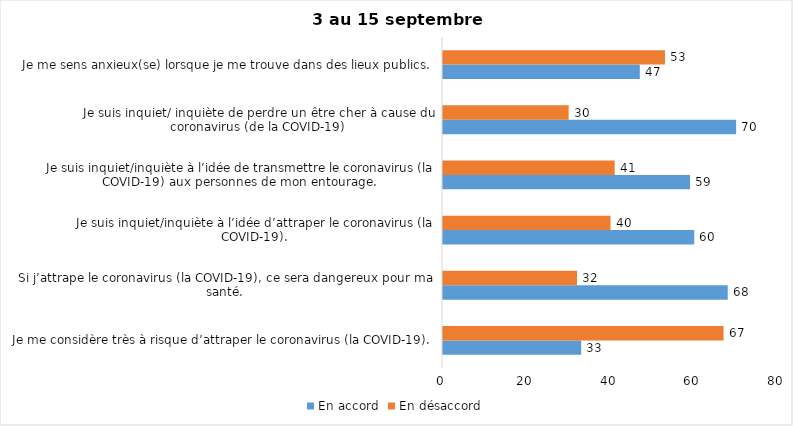
| Category | En accord | En désaccord |
|---|---|---|
| Je me considère très à risque d’attraper le coronavirus (la COVID-19). | 33 | 67 |
| Si j’attrape le coronavirus (la COVID-19), ce sera dangereux pour ma santé. | 68 | 32 |
| Je suis inquiet/inquiète à l’idée d’attraper le coronavirus (la COVID-19). | 60 | 40 |
| Je suis inquiet/inquiète à l’idée de transmettre le coronavirus (la COVID-19) aux personnes de mon entourage. | 59 | 41 |
| Je suis inquiet/ inquiète de perdre un être cher à cause du coronavirus (de la COVID-19) | 70 | 30 |
| Je me sens anxieux(se) lorsque je me trouve dans des lieux publics. | 47 | 53 |